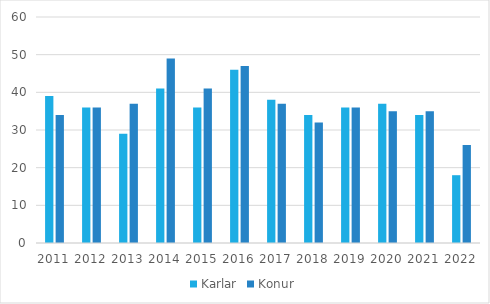
| Category | Karlar | Konur |
|---|---|---|
| 2011.0 | 39 | 34 |
| 2012.0 | 36 | 36 |
| 2013.0 | 29 | 37 |
| 2014.0 | 41 | 49 |
| 2015.0 | 36 | 41 |
| 2016.0 | 46 | 47 |
| 2017.0 | 38 | 37 |
| 2018.0 | 34 | 32 |
| 2019.0 | 36 | 36 |
| 2020.0 | 37 | 35 |
| 2021.0 | 34 | 35 |
| 2022.0 | 18 | 26 |